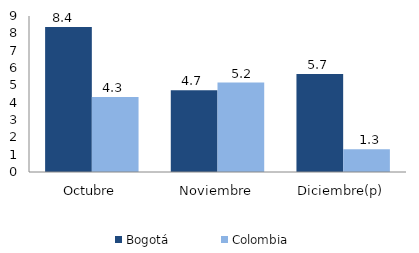
| Category | Bogotá | Colombia |
|---|---|---|
| Octubre | 8.37 | 4.321 |
| Noviembre | 4.713 | 5.161 |
| Diciembre(p) | 5.653 | 1.312 |